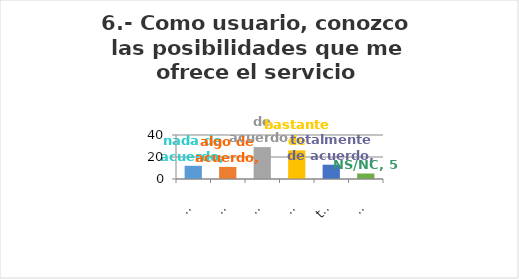
| Category | Series 0 |
|---|---|
| nada de acuerdo | 12 |
| algo de acuerdo | 11 |
| de acuerdo | 29 |
| bastante de acuerdo | 26 |
| totalmente de acuerdo | 13 |
| NS/NC | 5 |